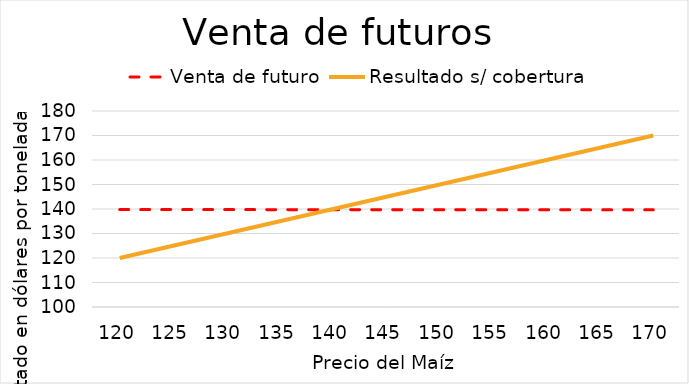
| Category | Venta de futuro | Resultado s/ cobertura |
|---|---|---|
| 120.0 | 139.778 | 120 |
| 125.0 | 139.766 | 125 |
| 130.0 | 139.754 | 130 |
| 135.0 | 139.741 | 135 |
| 140.0 | 139.729 | 140 |
| 145.0 | 139.716 | 145 |
| 150.0 | 139.704 | 150 |
| 155.0 | 139.691 | 155 |
| 160.0 | 139.678 | 160 |
| 165.0 | 139.666 | 165 |
| 170.0 | 139.654 | 170 |